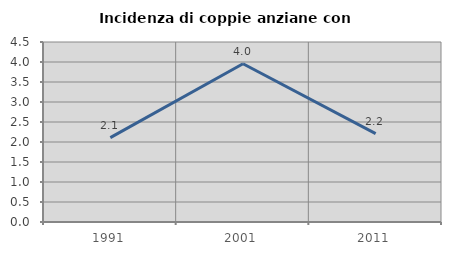
| Category | Incidenza di coppie anziane con figli |
|---|---|
| 1991.0 | 2.11 |
| 2001.0 | 3.957 |
| 2011.0 | 2.208 |